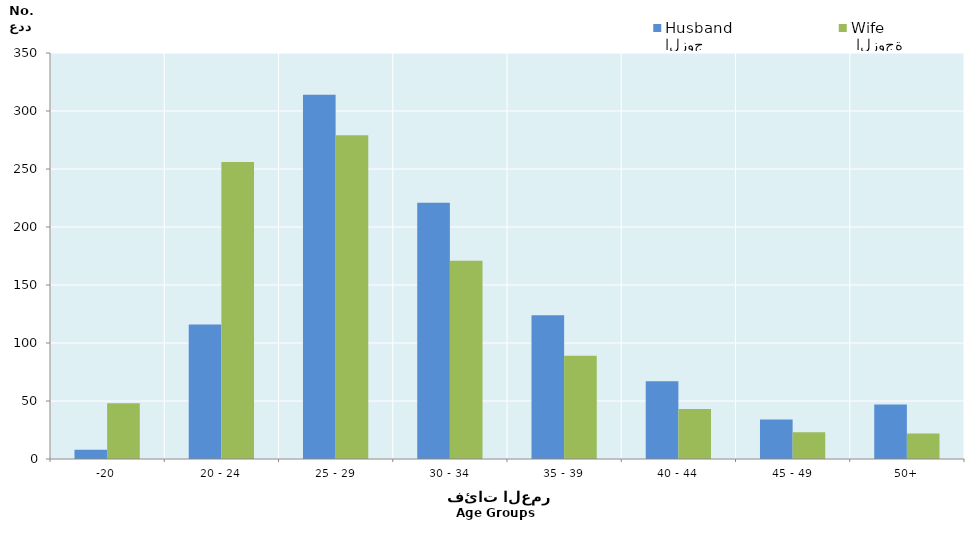
| Category | الزوج
Husband |  الزوجة
Wife |
|---|---|---|
| -20 | 8 | 48 |
| 20 - 24 | 116 | 256 |
| 25 - 29 | 314 | 279 |
| 30 - 34 | 221 | 171 |
| 35 - 39 | 124 | 89 |
| 40 - 44 | 67 | 43 |
| 45 - 49 | 34 | 23 |
| 50+ | 47 | 22 |